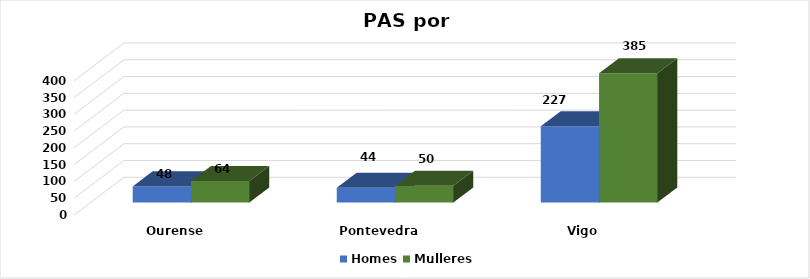
| Category | Homes | Mulleres |
|---|---|---|
| Ourense | 48 | 64 |
| Pontevedra | 44 | 50 |
| Vigo | 227 | 385 |